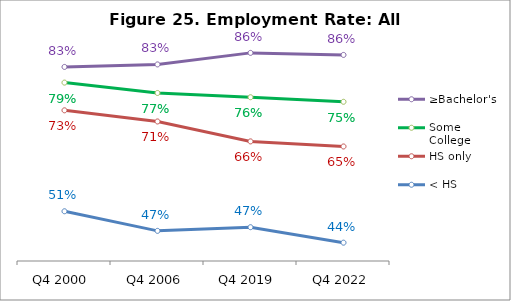
| Category | ≥Bachelor's | Some College | HS only | < HS |
|---|---|---|---|---|
| Q4 2000 | 0.829 | 0.795 | 0.733 | 0.51 |
| Q4 2006 | 0.835 | 0.772 | 0.709 | 0.467 |
| Q4 2019 | 0.86 | 0.762 | 0.665 | 0.475 |
| Q4 2022 | 0.856 | 0.752 | 0.653 | 0.441 |